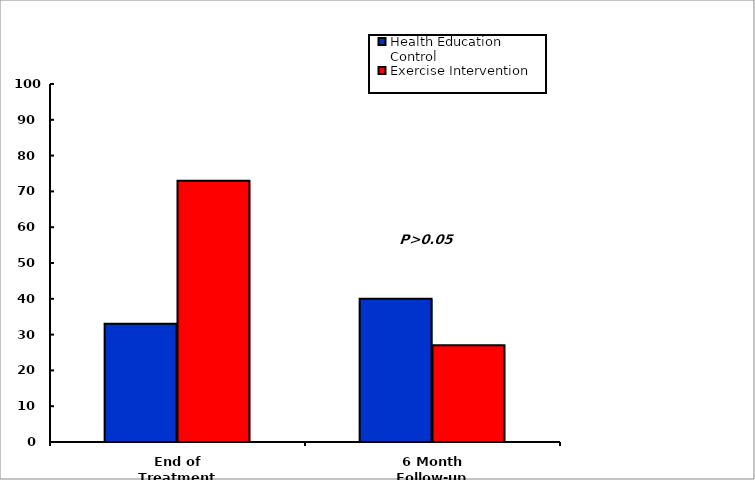
| Category | Health Education Control | Exercise Intervention |
|---|---|---|
| End of Treatment | 33 | 73 |
| 6 Month Follow-up | 40 | 27 |